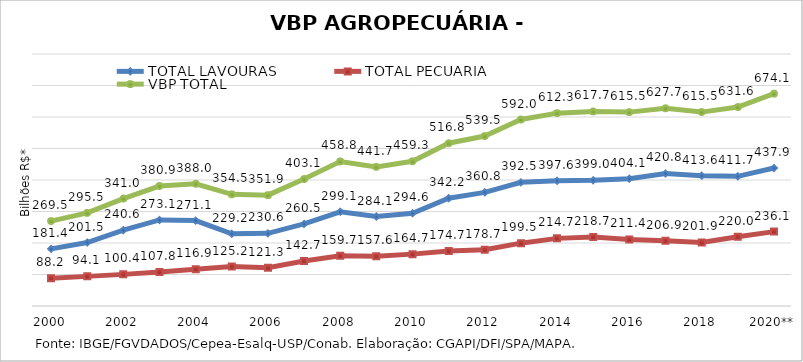
| Category | TOTAL LAVOURAS | TOTAL PECUÁRIA | VBP TOTAL |
|---|---|---|---|
| 2000 | 181.36 | 88.157 | 269.517 |
| 2001 | 201.458 | 94.053 | 295.51 |
| 2002 | 240.648 | 100.402 | 341.05 |
| 2003 | 273.134 | 107.764 | 380.897 |
| 2004 | 271.134 | 116.893 | 388.027 |
| 2005 | 229.231 | 125.221 | 354.452 |
| 2006 | 230.632 | 121.278 | 351.91 |
| 2007 | 260.457 | 142.677 | 403.133 |
| 2008 | 299.068 | 159.689 | 458.758 |
| 2009 | 284.075 | 157.612 | 441.688 |
| 2010 | 294.618 | 164.674 | 459.292 |
| 2011 | 342.162 | 174.677 | 516.839 |
| 2012 | 360.768 | 178.684 | 539.453 |
| 2013 | 392.518 | 199.479 | 591.998 |
| 2014 | 397.568 | 214.697 | 612.265 |
| 2015 | 399.011 | 218.717 | 617.728 |
| 2016 | 404.056 | 211.445 | 615.501 |
| 2017 | 420.844 | 206.901 | 627.746 |
| 2018 | 413.65 | 201.898 | 615.547 |
| 2019 | 411.668 | 219.97 | 631.638 |
| 2020** | 437.937 | 236.134 | 674.071 |